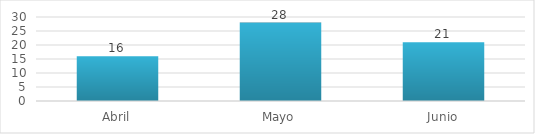
| Category | Series 0 |
|---|---|
| Abril | 16 |
| Mayo | 28 |
| Junio | 21 |